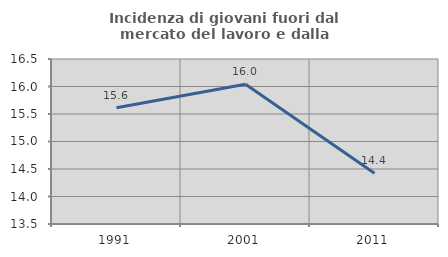
| Category | Incidenza di giovani fuori dal mercato del lavoro e dalla formazione  |
|---|---|
| 1991.0 | 15.615 |
| 2001.0 | 16.041 |
| 2011.0 | 14.423 |